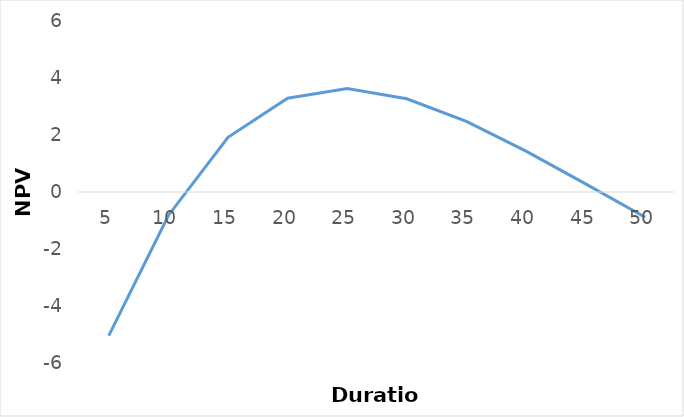
| Category | Series 0 |
|---|---|
| 5.0 | -5.037 |
| 10.0 | -0.823 |
| 15.0 | 1.918 |
| 20.0 | 3.288 |
| 25.0 | 3.629 |
| 30.0 | 3.27 |
| 35.0 | 2.475 |
| 40.0 | 1.434 |
| 45.0 | 0.285 |
| 50.0 | -0.884 |